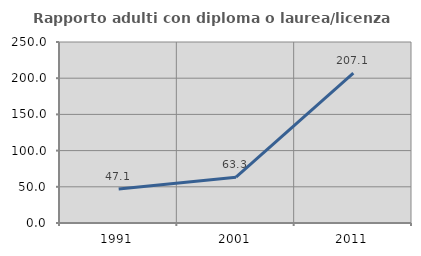
| Category | Rapporto adulti con diploma o laurea/licenza media  |
|---|---|
| 1991.0 | 47.059 |
| 2001.0 | 63.333 |
| 2011.0 | 207.143 |